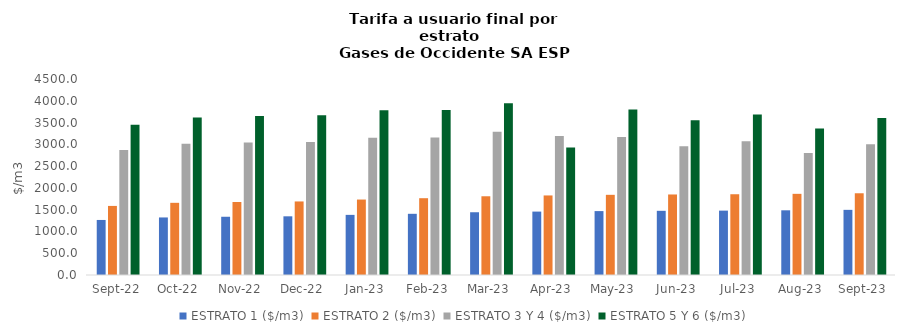
| Category | ESTRATO 1 ($/m3) | ESTRATO 2 ($/m3) | ESTRATO 3 Y 4 ($/m3) | ESTRATO 5 Y 6 ($/m3) |
|---|---|---|---|---|
| 2022-09-01 | 1263.63 | 1585.89 | 2872.55 | 3447.06 |
| 2022-10-01 | 1321.29 | 1657.05 | 3013.74 | 3616.488 |
| 2022-11-01 | 1337.14 | 1675.76 | 3041.35 | 3649.62 |
| 2022-12-01 | 1347.43 | 1688.66 | 3054.71 | 3665.652 |
| 2023-01-01 | 1380.44 | 1732.41 | 3153.94 | 3784.728 |
| 2023-02-01 | 1405.01 | 1763.25 | 3155.49 | 3786.588 |
| 2023-03-01 | 1440.79 | 1807.57 | 3288.4 | 3946.08 |
| 2023-04-01 | 1455.91 | 1826.55 | 3194.1 | 2929.63 |
| 2023-05-01 | 1467.27 | 1840.8 | 3166.38 | 3799.656 |
| 2023-06-01 | 1473.58 | 1848.72 | 2958.7 | 3550.44 |
| 2023-07-01 | 1478 | 1854.26 | 3071.96 | 3686.352 |
| 2023-08-01 | 1485.39 | 1863.53 | 2800.92 | 3361.104 |
| 2023-09-01 | 1495.79 | 1876.58 | 3003.77 | 3604.524 |